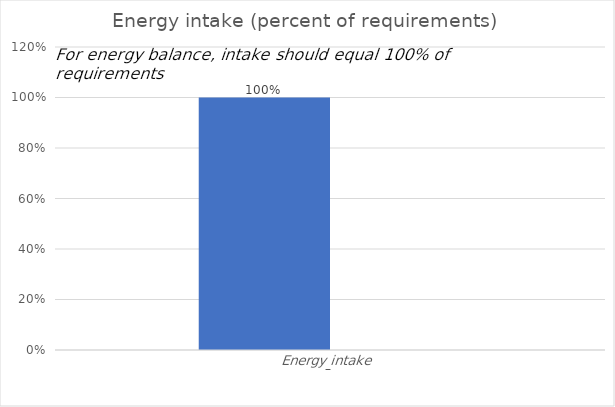
| Category | Series 0 | Series 1 |
|---|---|---|
| 0 | 1 |  |